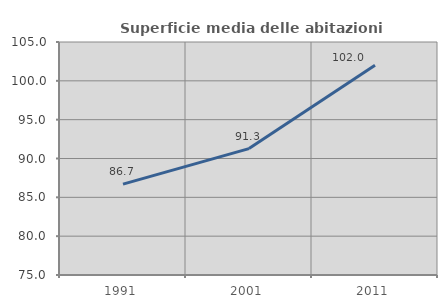
| Category | Superficie media delle abitazioni occupate |
|---|---|
| 1991.0 | 86.703 |
| 2001.0 | 91.276 |
| 2011.0 | 102.012 |